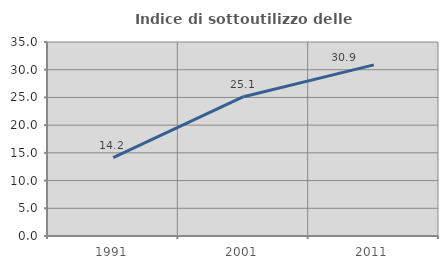
| Category | Indice di sottoutilizzo delle abitazioni  |
|---|---|
| 1991.0 | 14.154 |
| 2001.0 | 25.126 |
| 2011.0 | 30.866 |